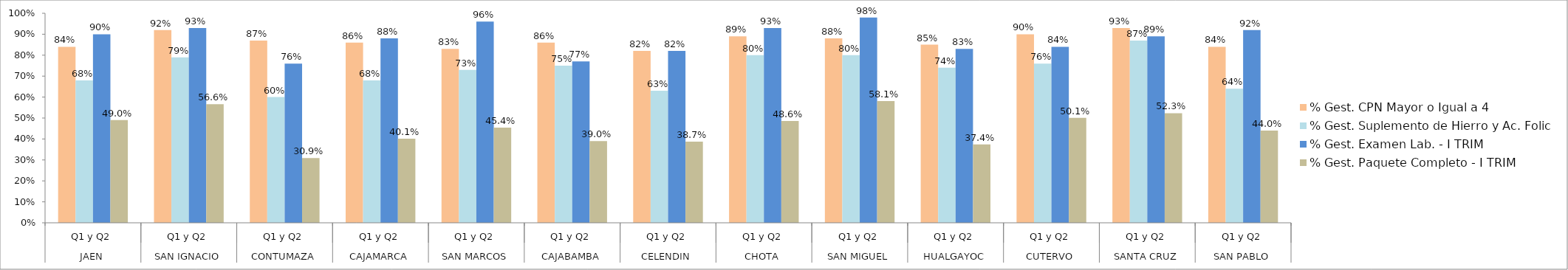
| Category | % Gest. CPN Mayor o Igual a 4 | % Gest. Suplemento de Hierro y Ac. Folic | % Gest. Examen Lab. - I TRIM | % Gest. Paquete Completo - I TRIM |
|---|---|---|---|---|
| 0 | 0.84 | 0.68 | 0.9 | 0.49 |
| 1 | 0.92 | 0.79 | 0.93 | 0.566 |
| 2 | 0.87 | 0.6 | 0.76 | 0.309 |
| 3 | 0.86 | 0.68 | 0.88 | 0.401 |
| 4 | 0.83 | 0.73 | 0.96 | 0.454 |
| 5 | 0.86 | 0.75 | 0.77 | 0.39 |
| 6 | 0.82 | 0.63 | 0.82 | 0.387 |
| 7 | 0.89 | 0.8 | 0.93 | 0.486 |
| 8 | 0.88 | 0.8 | 0.98 | 0.581 |
| 9 | 0.85 | 0.74 | 0.83 | 0.374 |
| 10 | 0.9 | 0.76 | 0.84 | 0.501 |
| 11 | 0.93 | 0.87 | 0.89 | 0.523 |
| 12 | 0.84 | 0.64 | 0.92 | 0.44 |